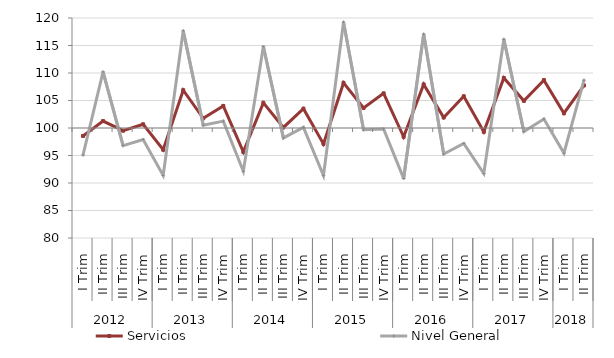
| Category | Servicios | Nivel General |
|---|---|---|
| 0 | 98.555 | 95.089 |
| 1/1/00 | 101.26 | 110.192 |
| 1/2/00 | 99.511 | 96.803 |
| 1/3/00 | 100.674 | 97.916 |
| 1/4/00 | 96.047 | 91.37 |
| 1/5/00 | 106.87 | 117.668 |
| 1/6/00 | 101.77 | 100.523 |
| 1/7/00 | 104.012 | 101.255 |
| 1/8/00 | 95.657 | 92.144 |
| 1/9/00 | 104.564 | 114.823 |
| 1/10/00 | 100.1 | 98.199 |
| 1/11/00 | 103.509 | 100.116 |
| 1/12/00 | 97.114 | 91.36 |
| 1/13/00 | 108.199 | 119.245 |
| 1/14/00 | 103.632 | 99.67 |
| 1/15/00 | 106.293 | 99.815 |
| 1/16/00 | 98.408 | 90.83 |
| 1/17/00 | 107.919 | 117.073 |
| 1/18/00 | 101.906 | 95.27 |
| 1/19/00 | 105.758 | 97.176 |
| 1/20/00 | 99.314 | 91.717 |
| 1/21/00 | 109.098 | 116.141 |
| 1/22/00 | 104.943 | 99.353 |
| 1/23/00 | 108.708 | 101.623 |
| 1/24/00 | 102.691 | 95.441 |
| 1/25/00 | 107.74 | 108.7 |